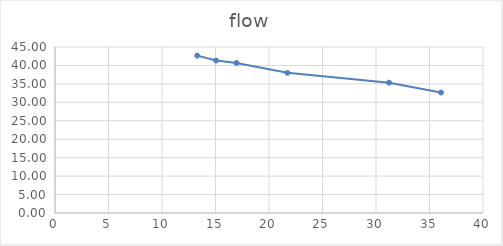
| Category | flow |
|---|---|
| 13.290000000000001 | 42.667 |
| 15.06 | 41.333 |
| 16.959999999999997 | 40.667 |
| 21.720000000000002 | 38 |
| 31.219999999999995 | 35.333 |
| 36.080000000000005 | 32.667 |